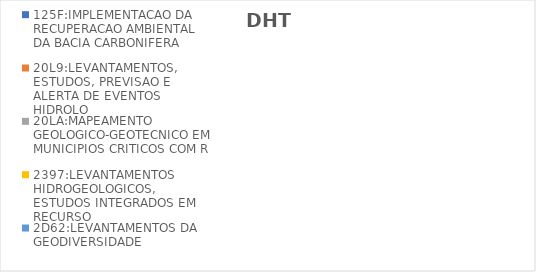
| Category | 125F:IMPLEMENTACAO DA RECUPERACAO AMBIENTAL DA BACIA CARBONIFERA | 20L9:LEVANTAMENTOS, ESTUDOS, PREVISAO E ALERTA DE EVENTOS HIDROLO | 20LA:MAPEAMENTO GEOLOGICO-GEOTECNICO EM MUNICIPIOS CRITICOS COM R | 2397:LEVANTAMENTOS HIDROGEOLOGICOS, ESTUDOS INTEGRADOS EM RECURSO | 2D62:LEVANTAMENTOS DA GEODIVERSIDADE |
|---|---|---|---|---|---|
| EXECUTADO | 0.044 | 0.179 | 0.182 | 0.164 | 0.304 |